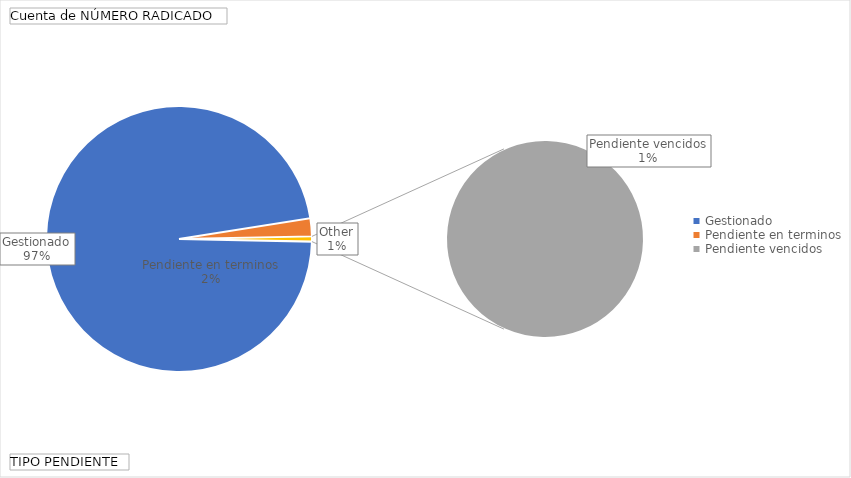
| Category | Total |
|---|---|
| Gestionado | 931 |
| Pendiente en terminos | 21 |
| Pendiente vencidos | 6 |